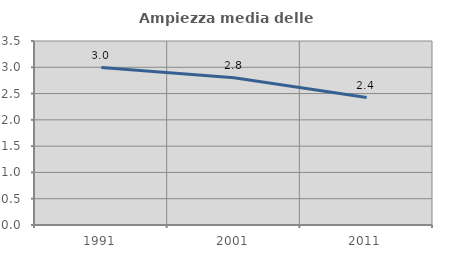
| Category | Ampiezza media delle famiglie |
|---|---|
| 1991.0 | 2.995 |
| 2001.0 | 2.803 |
| 2011.0 | 2.424 |